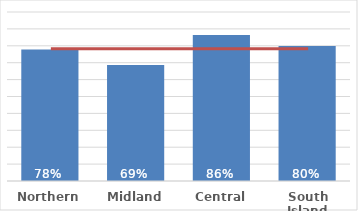
| Category | Total |
|---|---|
| Northern | 0.778 |
| Midland | 0.686 |
| Central | 0.864 |
| South Island | 0.799 |